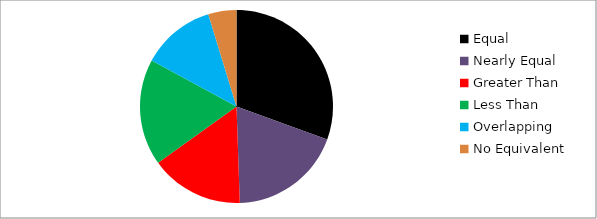
| Category | Series 0 |
|---|---|
| Equal | 84 |
| Nearly Equal | 52 |
| Greater Than | 43 |
| Less Than | 49 |
| Overlapping | 34 |
| No Equivalent | 13 |